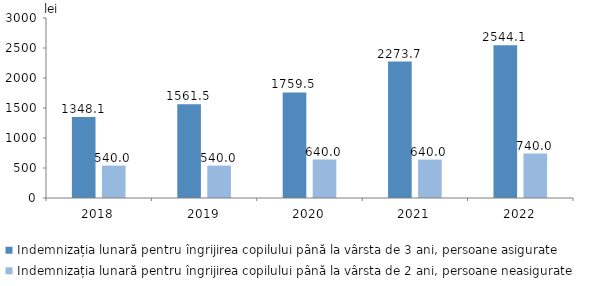
| Category | Indemnizația lunară pentru îngrijirea copilului până la vârsta de 3 ani, persoane asigurate | Indemnizația lunară pentru îngrijirea copilului până la vârsta de 2 ani, persoane neasigurate |
|---|---|---|
| 2018.0 | 1348.1 | 540 |
| 2019.0 | 1561.5 | 540 |
| 2020.0 | 1759.5 | 640 |
| 2021.0 | 2273.7 | 640 |
| 2022.0 | 2544.1 | 740 |